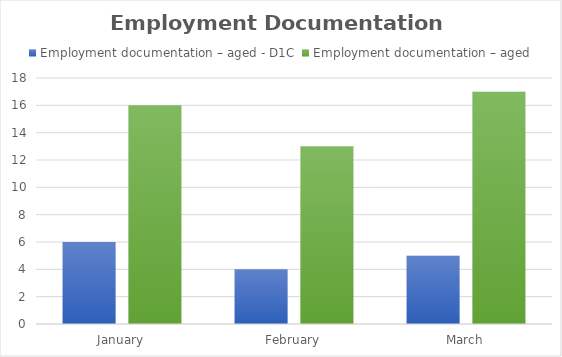
| Category | Employment documentation – aged - D1C | Employment documentation – aged |
|---|---|---|
| January | 6 | 16 |
| February | 4 | 13 |
| March | 5 | 17 |